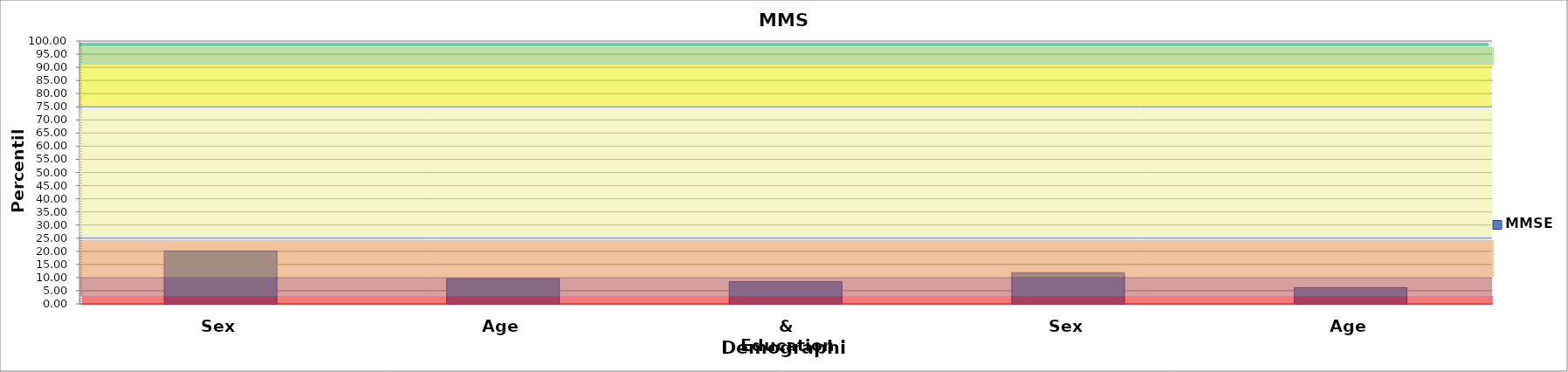
| Category | MMSE |
|---|---|
| 0 | 20.142 |
| 1 | 9.585 |
| 2 | 8.413 |
| 3 | 11.882 |
| 4 | 6.197 |